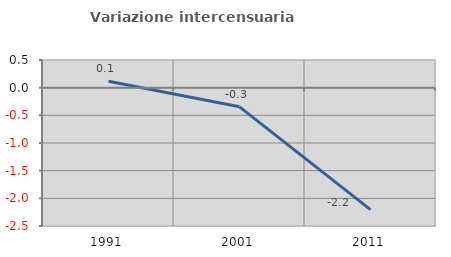
| Category | Variazione intercensuaria annua |
|---|---|
| 1991.0 | 0.117 |
| 2001.0 | -0.346 |
| 2011.0 | -2.203 |